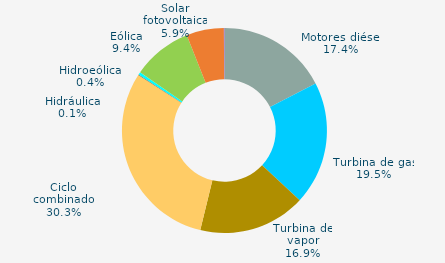
| Category | Series 0 |
|---|---|
| Motores diésel | 17.4 |
| Turbina de gas | 19.5 |
| Turbina de vapor | 16.9 |
| Ciclo combinado | 30.3 |
| Cogeneración | 0 |
| Hidráulica | 0.1 |
| Hidroeólica | 0.4 |
| Eólica | 9.4 |
| Solar fotovoltaica | 5.9 |
| Otras renovables | 0.1 |